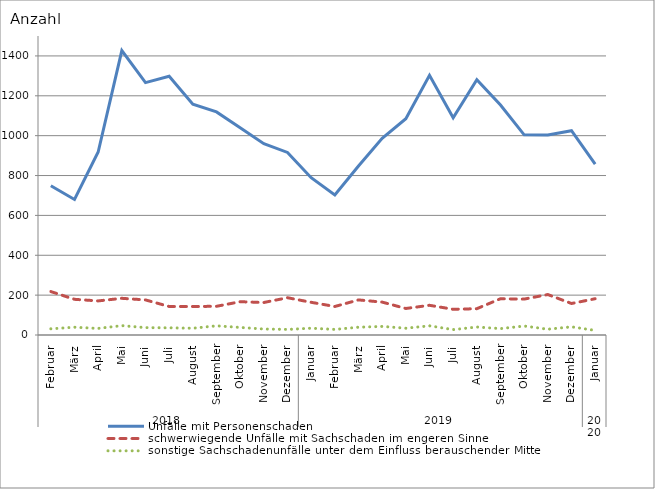
| Category | Unfälle mit Personenschaden | schwerwiegende Unfälle mit Sachschaden im engeren Sinne | sonstige Sachschadenunfälle unter dem Einfluss berauschender Mittel |
|---|---|---|---|
| 0 | 749 | 218 | 31 |
| 1 | 680 | 179 | 39 |
| 2 | 918 | 171 | 33 |
| 3 | 1427 | 184 | 47 |
| 4 | 1266 | 176 | 37 |
| 5 | 1298 | 143 | 36 |
| 6 | 1158 | 143 | 34 |
| 7 | 1119 | 144 | 46 |
| 8 | 1040 | 167 | 38 |
| 9 | 960 | 163 | 30 |
| 10 | 916 | 187 | 28 |
| 11 | 789 | 164 | 34 |
| 12 | 702 | 143 | 28 |
| 13 | 848 | 176 | 39 |
| 14 | 987 | 165 | 43 |
| 15 | 1085 | 133 | 34 |
| 16 | 1303 | 149 | 46 |
| 17 | 1090 | 129 | 27 |
| 18 | 1281 | 132 | 40 |
| 19 | 1154 | 182 | 32 |
| 20 | 1004 | 180 | 45 |
| 21 | 1003 | 203 | 29 |
| 22 | 1025 | 158 | 41 |
| 23 | 857 | 182 | 23 |